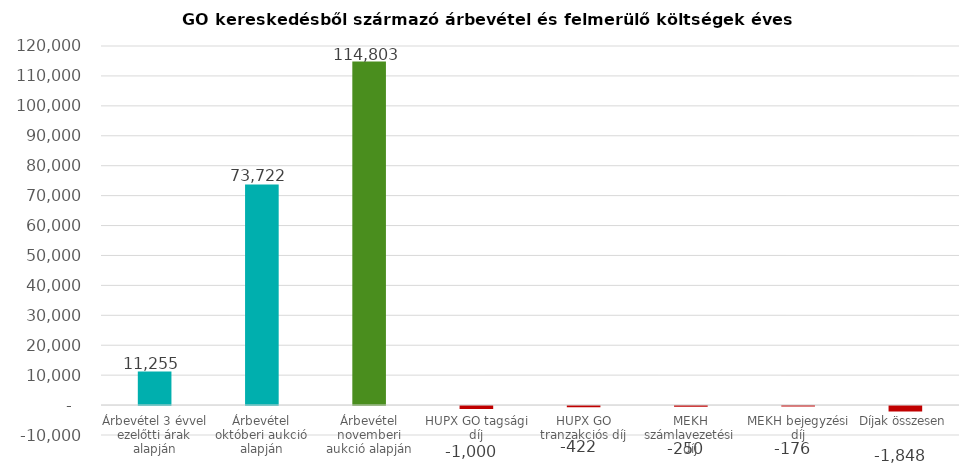
| Category | Series 0 |
|---|---|
| Árbevétel 3 évvel ezelőtti árak alapján | 11255.2 |
| Árbevétel októberi aukció alapján | 73721.56 |
| Árbevétel novemberi aukció alapján | 114803.04 |
| HUPX GO tagsági díj | -1000 |
| HUPX GO tranzakciós díj | -422.07 |
| MEKH számlavezetési díj | -250 |
| MEKH bejegyzési díj | -175.862 |
| Díjak összesen | -1847.932 |